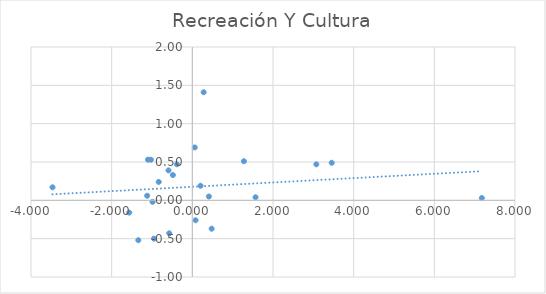
| Category | Recreación Y Cultura |
|---|---|
| 0.06052582200249956 | 0.69 |
| -1.339539147515001 | -0.52 |
| -1.1203229332582998 | 0.06 |
| -0.9862037445886013 | -0.02 |
| -3.4662710747771994 | 0.17 |
| 0.4103518494638997 | 0.05 |
| -1.5653149541481977 | -0.16 |
| 1.5673496706761991 | 0.04 |
| 7.1770364527009995 | 0.03 |
| 0.47884246635880034 | -0.37 |
| -0.832734952533401 | 0.24 |
| 3.4562493478376117 | 0.49 |
| 0.28079979651694786 | 1.41 |
| -0.5906758229193689 | 0.39 |
| -0.38208630553888956 | 0.47 |
| -0.5726169698249004 | -0.43 |
| 0.08025158798270066 | -0.26 |
| 1.2789830493301095 | 0.51 |
| -1.1005497828799102 | 0.53 |
| 0.20330044603610042 | 0.19 |
| -0.48222478231940147 | 0.33 |
| -0.9518304220709997 | -0.5 |
| -1.027059621055 | 0.53 |
| 3.074367518631871 | 0.47 |